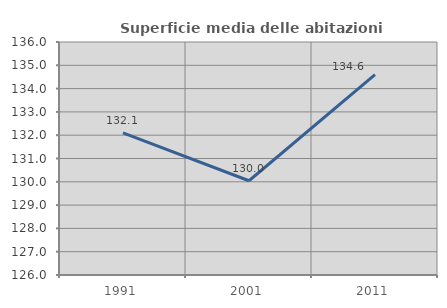
| Category | Superficie media delle abitazioni occupate |
|---|---|
| 1991.0 | 132.101 |
| 2001.0 | 130.046 |
| 2011.0 | 134.597 |